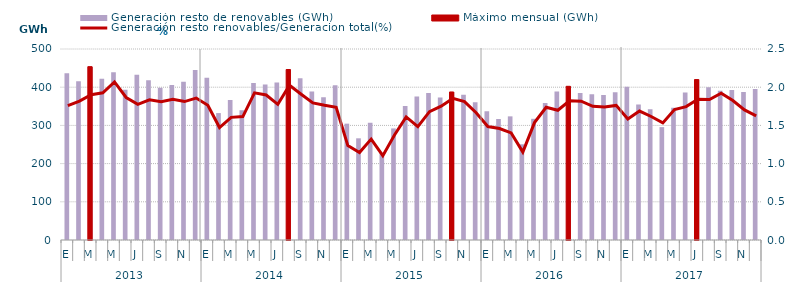
| Category | Generación resto de renovables (GWh) | Máximo mensual (GWh) |
|---|---|---|
| 0 | 436.523 | 0 |
| 1 | 415.741 | 0 |
| 2 | 453.8 | 453.8 |
| 3 | 422.256 | 0 |
| 4 | 438.812 | 0 |
| 5 | 393.223 | 0 |
| 6 | 432.786 | 0 |
| 7 | 418.18 | 0 |
| 8 | 398.674 | 0 |
| 9 | 405.476 | 0 |
| 10 | 414.208 | 0 |
| 11 | 445.016 | 0 |
| 12 | 424.456 | 0 |
| 13 | 332.233 | 0 |
| 14 | 366.407 | 0 |
| 15 | 339.558 | 0 |
| 16 | 410.952 | 0 |
| 17 | 407.037 | 0 |
| 18 | 412.221 | 0 |
| 19 | 446.327 | 446.327 |
| 20 | 423.108 | 0 |
| 21 | 388.689 | 0 |
| 22 | 373.763 | 0 |
| 23 | 405.049 | 0 |
| 24 | 304.577 | 0 |
| 25 | 266.217 | 0 |
| 26 | 306.907 | 0 |
| 27 | 228.048 | 0 |
| 28 | 292.116 | 0 |
| 29 | 350.67 | 0 |
| 30 | 375.597 | 0 |
| 31 | 384.609 | 0 |
| 32 | 373.349 | 0 |
| 33 | 387.523 | 387.523 |
| 34 | 380.042 | 0 |
| 35 | 360.926 | 0 |
| 36 | 337.139 | 0 |
| 37 | 316.832 | 0 |
| 38 | 323.682 | 0 |
| 39 | 250.56 | 0 |
| 40 | 317.305 | 0 |
| 41 | 358.702 | 0 |
| 42 | 388.967 | 0 |
| 43 | 402.354 | 402.354 |
| 44 | 384.915 | 0 |
| 45 | 381.308 | 0 |
| 46 | 379.732 | 0 |
| 47 | 386.559 | 0 |
| 48 | 401.035 | 0 |
| 49 | 354.815 | 0 |
| 50 | 342.557 | 0 |
| 51 | 295.481 | 0 |
| 52 | 346.184 | 0 |
| 53 | 386.136 | 0 |
| 54 | 419.959 | 419.959 |
| 55 | 399.678 | 0 |
| 56 | 390.389 | 0 |
| 57 | 392.541 | 0 |
| 58 | 387.372 | 0 |
| 59 | 395.36 | 0 |